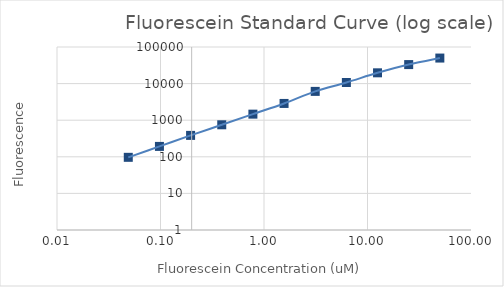
| Category | Series 1 |
|---|---|
| 50.0 | 49867.25 |
| 25.0 | 33077.25 |
| 12.5 | 19706.5 |
| 6.25 | 10716 |
| 3.125 | 6128.25 |
| 1.5625 | 2870.25 |
| 0.78125 | 1463.5 |
| 0.390625 | 749 |
| 0.1953125 | 384.5 |
| 0.09765625 | 192.25 |
| 0.048828125 | 96.75 |